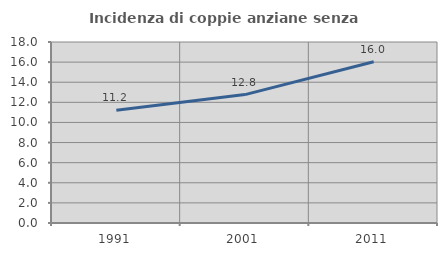
| Category | Incidenza di coppie anziane senza figli  |
|---|---|
| 1991.0 | 11.207 |
| 2001.0 | 12.768 |
| 2011.0 | 16.043 |